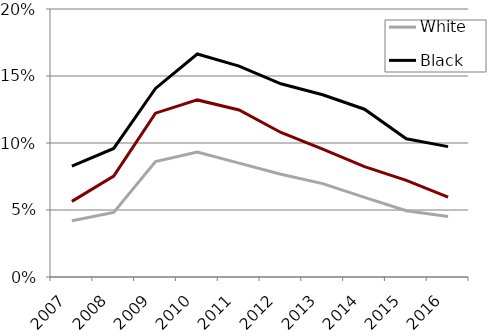
| Category | White | Black | Hispanic |
|---|---|---|---|
| 2007.0 | 0.042 | 0.083 | 0.056 |
| 2008.0 | 0.048 | 0.096 | 0.075 |
| 2009.0 | 0.086 | 0.141 | 0.122 |
| 2010.0 | 0.093 | 0.166 | 0.132 |
| 2011.0 | 0.085 | 0.157 | 0.125 |
| 2012.0 | 0.077 | 0.144 | 0.108 |
| 2013.0 | 0.07 | 0.136 | 0.095 |
| 2014.0 | 0.059 | 0.125 | 0.082 |
| 2015.0 | 0.05 | 0.103 | 0.072 |
| 2016.0 | 0.045 | 0.097 | 0.06 |